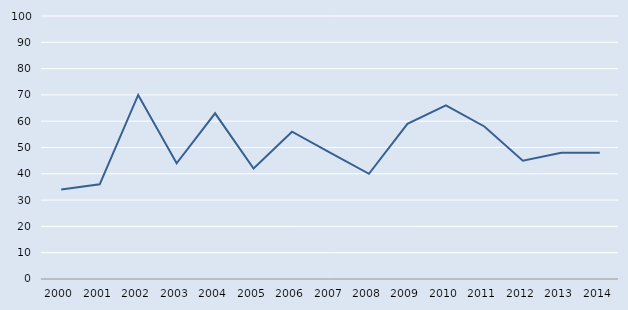
| Category | Series 0 |
|---|---|
| 2000.0 | 34 |
| 2001.0 | 36 |
| 2002.0 | 70 |
| 2003.0 | 44 |
| 2004.0 | 63 |
| 2005.0 | 42 |
| 2006.0 | 56 |
| 2007.0 | 48 |
| 2008.0 | 40 |
| 2009.0 | 59 |
| 2010.0 | 66 |
| 2011.0 | 58 |
| 2012.0 | 45 |
| 2013.0 | 48 |
| 2014.0 | 48 |